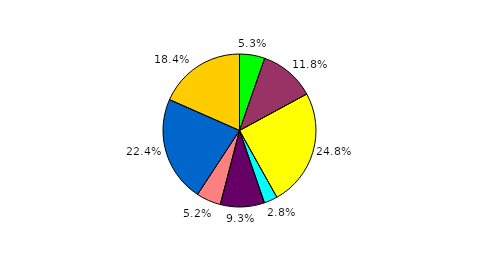
| Category | Series 0 |
|---|---|
| 0 | 5.338 |
| 1 | 11.757 |
| 2 | 24.783 |
| 3 | 2.843 |
| 4 | 9.316 |
| 5 | 5.203 |
| 6 | 22.369 |
| 7 | 18.391 |